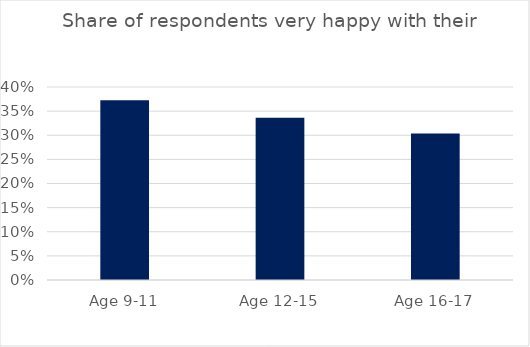
| Category | Share of respondents very happy with their friendships |
|---|---|
| Age 9-11 | 0.372 |
| Age 12-15 | 0.336 |
| Age 16-17 | 0.303 |